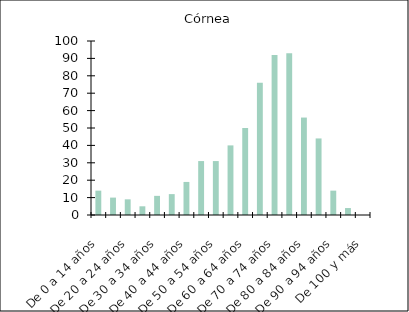
| Category | Córnea |
|---|---|
| De 0 a 14 años | 14 |
| De 15 a 19 años | 10 |
| De 20 a 24 años | 9 |
| De 25 a 29 años | 5 |
| De 30 a 34 años | 11 |
| De 35 a 39 años | 12 |
| De 40 a 44 años | 19 |
| De 45 a 49 años | 31 |
| De 50 a 54 años | 31 |
| De 55 a 59 años | 40 |
| De 60 a 64 años | 50 |
| De 65 a 69 años | 76 |
| De 70 a 74 años | 92 |
| De 75 a 79 años | 93 |
| De 80 a 84 años | 56 |
| De 85 a 89 años | 44 |
| De 90 a 94 años | 14 |
| De 95 a 99 años | 4 |
| De 100 y más | 0 |